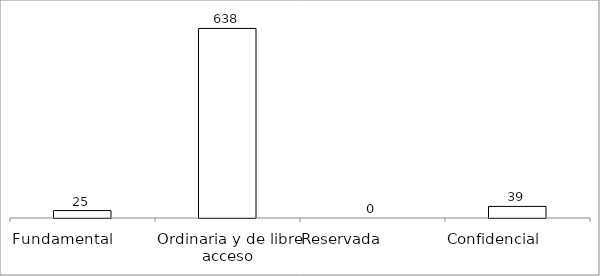
| Category | Series 0 |
|---|---|
| Fundamental         | 25 |
| Ordinaria y de libre acceso | 638 |
| Reservada               | 0 |
| Confidencial             | 39 |